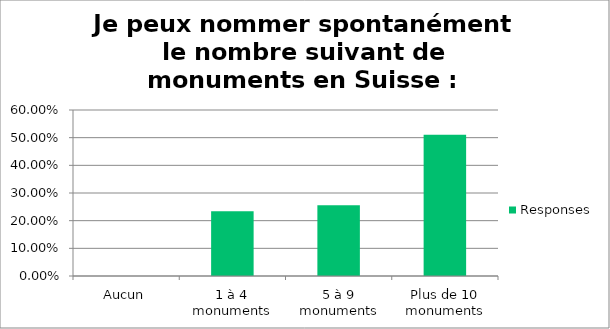
| Category | Responses |
|---|---|
| Aucun | 0 |
| 1 à 4 monuments | 0.234 |
| 5 à 9 monuments | 0.255 |
| Plus de 10 monuments | 0.511 |